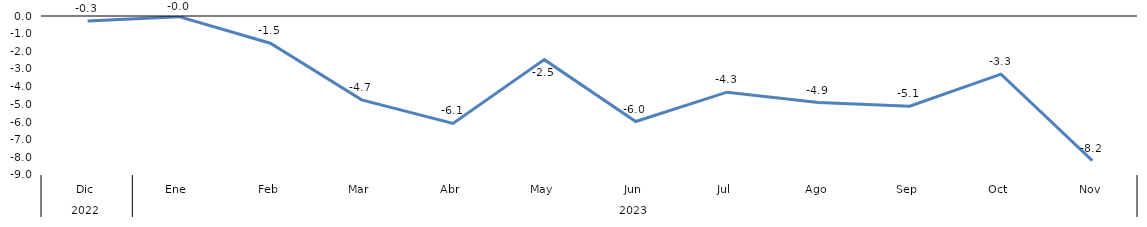
| Category | Bogotá |
|---|---|
| 0 | -0.288 |
| 1 | -0.036 |
| 2 | -1.54 |
| 3 | -4.748 |
| 4 | -6.083 |
| 5 | -2.47 |
| 6 | -5.973 |
| 7 | -4.31 |
| 8 | -4.897 |
| 9 | -5.102 |
| 10 | -3.29 |
| 11 | -8.19 |